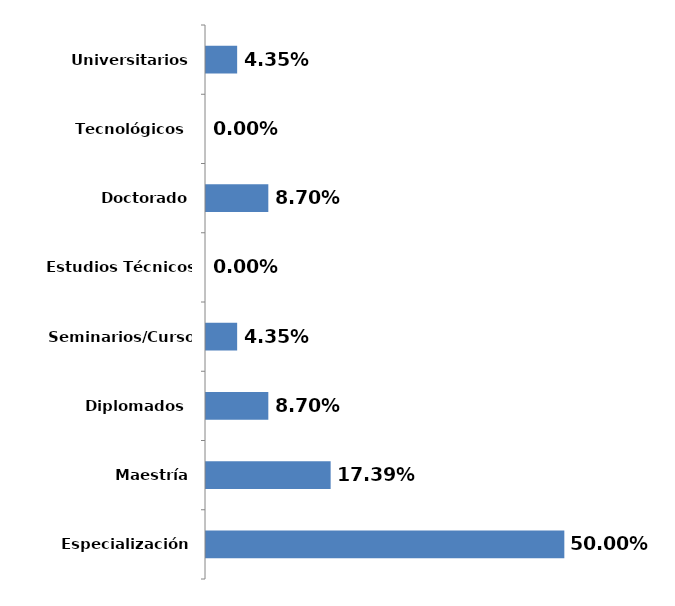
| Category | Series 0 |
|---|---|
| Especialización | 0.5 |
| Maestría | 0.174 |
| Diplomados  | 0.087 |
| Seminarios/Cursos  | 0.043 |
| Estudios Técnicos  | 0 |
| Doctorado | 0.087 |
| Tecnológicos  | 0 |
| Universitarios | 0.043 |